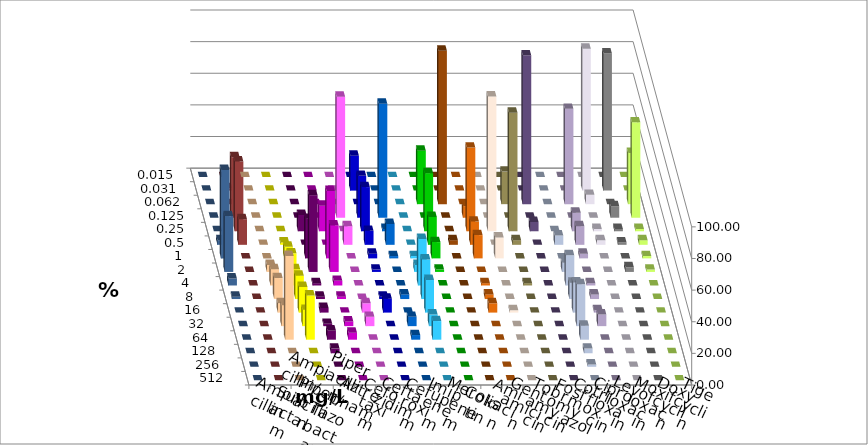
| Category | Ampicillin | Ampicillin/ Sulbactam | Piperacillin | Piperacillin/ Tazobactam | Aztreonam | Cefotaxim | Ceftazidim | Cefuroxim | Imipenem | Meropenem | Colistin | Amikacin | Gentamicin | Tobramycin | Fosfomycin | Cotrimoxazol | Ciprofloxacin | Levofloxacin | Moxifloxacin | Doxycyclin | Tigecyclin |
|---|---|---|---|---|---|---|---|---|---|---|---|---|---|---|---|---|---|---|---|---|---|
| 0.015 | 0 | 0 | 0 | 0 | 0 | 0 | 0 | 0 | 0 | 0 | 0 | 0 | 0 | 0 | 0 | 0 | 0 | 0 | 0 | 0 | 0 |
| 0.031 | 0 | 0 | 0 | 0 | 0 | 22.059 | 0 | 0 | 0 | 0 | 0 | 0 | 0 | 0 | 0 | 0 | 89.706 | 86.765 | 0 | 0 | 1.471 |
| 0.062 | 0 | 0 | 0 | 0 | 0 | 0 | 0 | 0 | 33.824 | 97.059 | 0 | 0 | 20.588 | 94.118 | 0 | 60.294 | 5.882 | 0 | 32.353 | 0 | 0 |
| 0.125 | 0 | 0 | 0 | 0 | 76.471 | 26.471 | 72.059 | 0 | 0 | 0 | 7.353 | 0 | 0 | 0 | 0 | 0 | 0 | 7.353 | 60.294 | 0 | 38.235 |
| 0.25 | 0 | 0 | 10.294 | 16.176 | 0 | 27.941 | 1.471 | 0 | 36.765 | 0 | 52.941 | 85.294 | 75 | 5.882 | 0 | 11.765 | 1.471 | 1.471 | 1.471 | 0 | 44.118 |
| 0.5 | 0 | 1.471 | 0 | 0 | 11.765 | 8.824 | 13.235 | 0 | 17.647 | 2.941 | 14.706 | 0 | 2.941 | 0 | 5.882 | 11.765 | 2.941 | 1.471 | 2.941 | 2.941 | 16.176 |
| 1.0 | 0 | 7.353 | 25 | 42.647 | 0 | 2.941 | 1.471 | 1.471 | 10.294 | 0 | 14.706 | 13.235 | 0 | 0 | 0 | 2.941 | 0 | 0 | 1.471 | 55.882 | 0 |
| 2.0 | 4.412 | 11.765 | 48.529 | 29.412 | 0 | 1.471 | 0 | 4.412 | 1.471 | 0 | 0 | 0 | 0 | 0 | 5.882 | 0 | 0 | 2.941 | 1.471 | 35.294 | 0 |
| 4.0 | 10.294 | 10.294 | 1.471 | 2.941 | 0 | 0 | 0 | 29.412 | 0 | 0 | 1.471 | 0 | 1.471 | 0 | 19.118 | 1.471 | 0 | 0 | 0 | 4.412 | 0 |
| 8.0 | 13.235 | 14.706 | 1.471 | 1.471 | 0 | 1.471 | 2.941 | 25 | 0 | 0 | 2.941 | 0 | 0 | 0 | 10.294 | 2.941 | 0 | 0 | 0 | 1.471 | 0 |
| 16.0 | 5.882 | 16.176 | 2.941 | 0 | 5.882 | 8.824 | 0 | 20.588 | 0 | 0 | 5.882 | 1.471 | 0 | 0 | 19.118 | 1.471 | 0 | 0 | 0 | 0 | 0 |
| 32.0 | 13.235 | 10.294 | 1.471 | 2.941 | 5.882 | 0 | 5.882 | 7.353 | 0 | 0 | 0 | 0 | 0 | 0 | 26.471 | 7.353 | 0 | 0 | 0 | 0 | 0 |
| 64.0 | 52.941 | 27.941 | 5.882 | 4.412 | 0 | 0 | 2.941 | 11.765 | 0 | 0 | 0 | 0 | 0 | 0 | 8.824 | 0 | 0 | 0 | 0 | 0 | 0 |
| 128.0 | 0 | 0 | 2.941 | 0 | 0 | 0 | 0 | 0 | 0 | 0 | 0 | 0 | 0 | 0 | 2.941 | 0 | 0 | 0 | 0 | 0 | 0 |
| 256.0 | 0 | 0 | 0 | 0 | 0 | 0 | 0 | 0 | 0 | 0 | 0 | 0 | 0 | 0 | 1.471 | 0 | 0 | 0 | 0 | 0 | 0 |
| 512.0 | 0 | 0 | 0 | 0 | 0 | 0 | 0 | 0 | 0 | 0 | 0 | 0 | 0 | 0 | 0 | 0 | 0 | 0 | 0 | 0 | 0 |